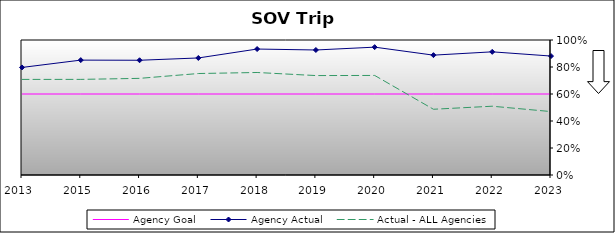
| Category | Agency Goal | Agency Actual | Actual - ALL Agencies |
|---|---|---|---|
| 2013.0 | 0.6 | 0.797 | 0.708 |
| 2015.0 | 0.6 | 0.851 | 0.708 |
| 2016.0 | 0.6 | 0.85 | 0.716 |
| 2017.0 | 0.6 | 0.867 | 0.752 |
| 2018.0 | 0.6 | 0.933 | 0.759 |
| 2019.0 | 0.6 | 0.926 | 0.736 |
| 2020.0 | 0.6 | 0.947 | 0.737 |
| 2021.0 | 0.6 | 0.888 | 0.487 |
| 2022.0 | 0.6 | 0.912 | 0.509 |
| 2023.0 | 0.6 | 0.881 | 0.47 |